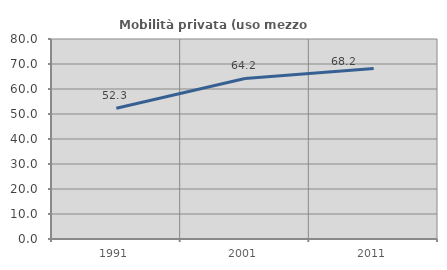
| Category | Mobilità privata (uso mezzo privato) |
|---|---|
| 1991.0 | 52.324 |
| 2001.0 | 64.222 |
| 2011.0 | 68.246 |